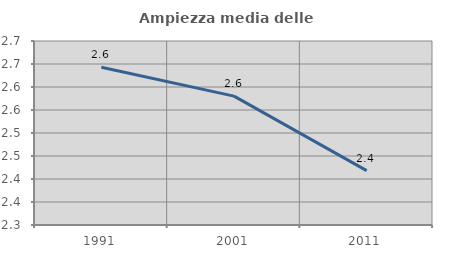
| Category | Ampiezza media delle famiglie |
|---|---|
| 1991.0 | 2.643 |
| 2001.0 | 2.58 |
| 2011.0 | 2.418 |